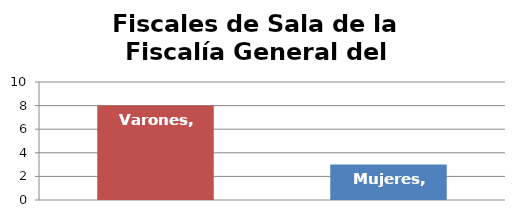
| Category | Fiscales de Sala de la Fiscalía General del Estado |
|---|---|
| Varones | 8 |
| Mujeres | 3 |